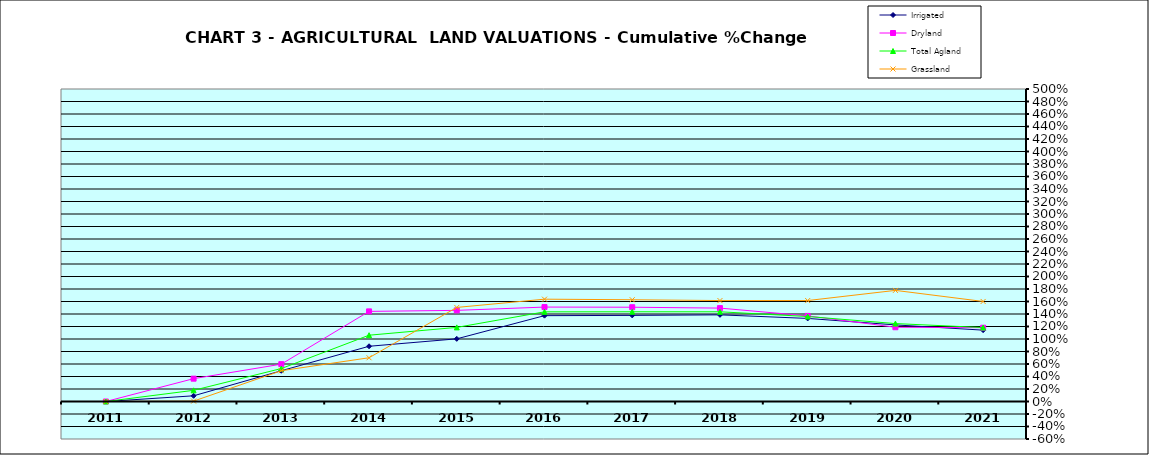
| Category | Irrigated | Dryland | Total Agland | Grassland |
|---|---|---|---|---|
| 2011.0 | 0 | 0 | 0 | 0 |
| 2012.0 | 0.091 | 0.365 | 0.179 | 0.006 |
| 2013.0 | 0.492 | 0.598 | 0.527 | 0.493 |
| 2014.0 | 0.884 | 1.442 | 1.061 | 0.7 |
| 2015.0 | 1.003 | 1.458 | 1.186 | 1.505 |
| 2016.0 | 1.374 | 1.511 | 1.435 | 1.637 |
| 2017.0 | 1.378 | 1.508 | 1.436 | 1.628 |
| 2018.0 | 1.386 | 1.494 | 1.435 | 1.615 |
| 2019.0 | 1.329 | 1.37 | 1.36 | 1.615 |
| 2020.0 | 1.225 | 1.188 | 1.247 | 1.778 |
| 2021.0 | 1.142 | 1.181 | 1.183 | 1.601 |